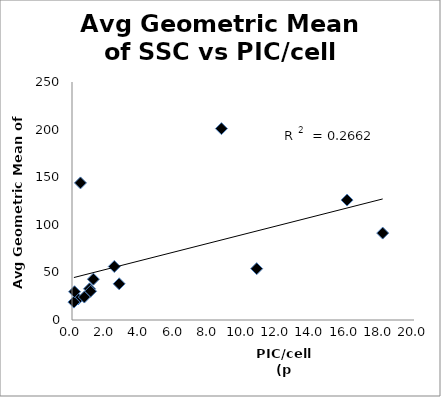
| Category | Series 0 |
|---|---|
| 0.360000000000001 | 22.1 |
| 0.110650069156293 | 18.8 |
| 1.023965141612201 | 32.8 |
| 18.16925734024179 | 91.3 |
| 8.739290085679313 | 201 |
| 1.083890126206384 | 30.2 |
| 0.493827160493826 | 144 |
| 0.14814814814815 | 29.7 |
| 16.08602150537634 | 126 |
| 2.472989195678272 | 56.2 |
| 2.758620689655171 | 38 |
| 0.720238095238095 | 24.1 |
| 1.250601250601251 | 42.9 |
| 10.80128205128205 | 53.9 |